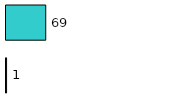
| Category | Series 0 | Series 1 |
|---|---|---|
| 0 | 1 | 69 |